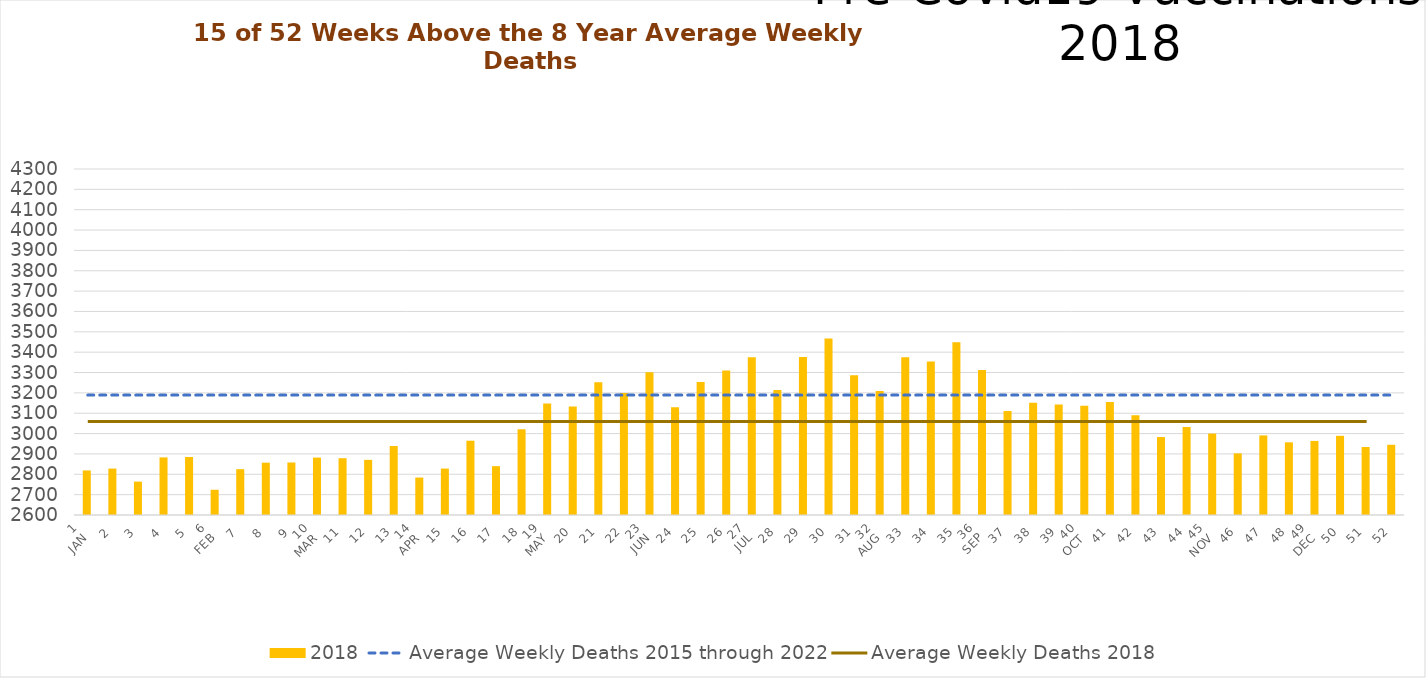
| Category | 2018 |
|---|---|
| 1
JAN | 2819 |
| 2 | 2828 |
| 3 | 2764 |
| 4 | 2883 |
| 5 | 2885 |
| 6
FEB | 2724 |
| 7 | 2825 |
| 8 | 2857 |
| 9 | 2858 |
| 10
MAR | 2882 |
| 11 | 2879 |
| 12 | 2871 |
| 13 | 2939 |
| 14
APR | 2784 |
| 15 | 2828 |
| 16 | 2965 |
| 17 | 2840 |
| 18 | 3021 |
| 19
MAY | 3148 |
| 20 | 3133 |
| 21 | 3252 |
| 22 | 3199 |
| 23
JUN | 3301 |
| 24 | 3130 |
| 25 | 3254 |
| 26 | 3310 |
| 27
JUL | 3375 |
| 28 | 3214 |
| 29 | 3376 |
| 30 | 3467 |
| 31 | 3287 |
| 32
AUG | 3209 |
| 33 | 3375 |
| 34 | 3354 |
| 35 | 3449 |
| 36
SEP | 3313 |
| 37 | 3111 |
| 38 | 3152 |
| 39 | 3143 |
| 40
OCT | 3137 |
| 41 | 3155 |
| 42 | 3090 |
| 43 | 2983 |
| 44 | 3032 |
| 45
NOV | 3000 |
| 46 | 2903 |
| 47 | 2991 |
| 48 | 2957 |
| 49
DEC | 2964 |
| 50 | 2989 |
| 51 | 2934 |
| 52 | 2945 |